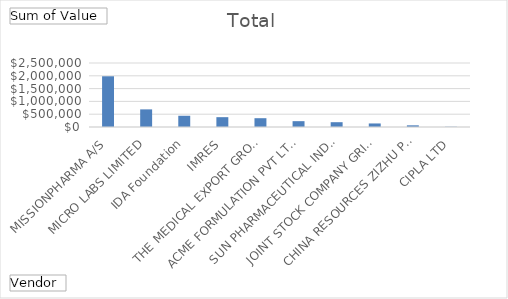
| Category | Total |
|---|---|
| MISSIONPHARMA A/S | 1981108.45 |
| MICRO LABS LIMITED | 688160 |
| IDA Foundation | 439047.95 |
| IMRES | 383915 |
| THE MEDICAL EXPORT GROUP BV | 343723.7 |
| ACME FORMULATION PVT LTD | 227800 |
| SUN PHARMACEUTICAL INDUSTRIES LTD. | 187740 |
| JOINT STOCK COMPANY GRINDEKS | 138180 |
| CHINA RESOURCES ZIZHU PHARMACEUTICAL CO | 65033 |
| CIPLA LTD | 8991 |